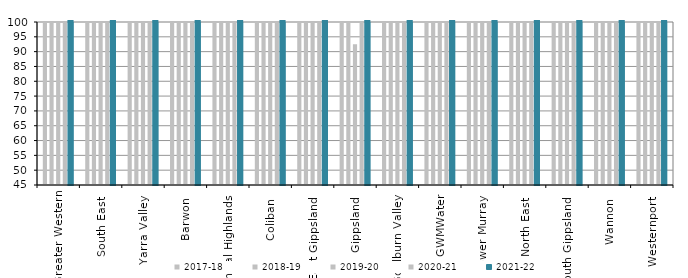
| Category | 2017-18 | 2018-19 | 2019-20 | 2020-21 | 2021-22 |
|---|---|---|---|---|---|
| Greater Western | 100 | 100 | 100 | 100 | 100 |
| South East  | 100 | 100 | 100 | 100 | 100 |
| Yarra Valley  | 100 | 100 | 100 | 100 | 100 |
| Barwon  | 100 | 100 | 100 | 100 | 100 |
| Central Highlands  | 100 | 100 | 100 | 100 | 100 |
| Coliban  | 100 | 100 | 100 | 100 | 100 |
| East Gippsland  | 100 | 100 | 100 | 100 | 100 |
| Gippsland  | 100 | 100 | 92.5 | 100 | 100 |
| Goulburn Valley  | 100 | 100 | 100 | 100 | 100 |
| GWMWater | 100 | 100 | 100 | 100 | 100 |
| Lower Murray  | 100 | 100 | 100 | 100 | 100 |
| North East  | 100 | 100 | 100 | 100 | 100 |
| South Gippsland  | 100 | 100 | 100 | 100 | 100 |
| Wannon  | 100 | 100 | 100 | 100 | 100 |
| Westernport  | 100 | 100 | 100 | 100 | 100 |